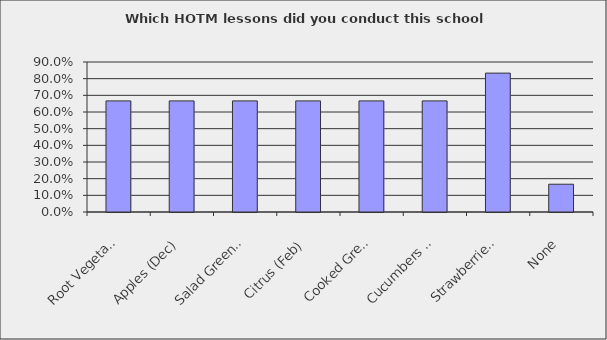
| Category | Series 0 |
|---|---|
| Root Vegetable (Nov) | 0.667 |
| Apples (Dec) | 0.667 |
| Salad Greens (Jan) | 0.667 |
| Citrus (Feb) | 0.667 |
| Cooked Greens (Mar) | 0.667 |
| Cucumbers (Apr) | 0.667 |
| Strawberries (May) | 0.833 |
| None | 0.167 |